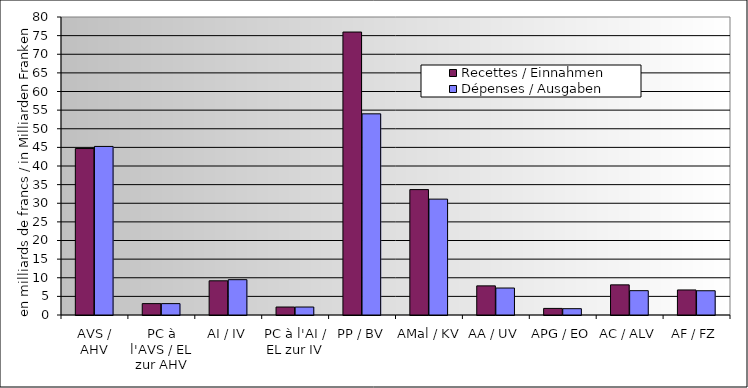
| Category | Recettes / Einnahmen | Dépenses / Ausgaben |
|---|---|---|
| AVS / AHV | 44.689 | 45.254 |
| PC à l'AVS / EL zur AHV | 3.058 | 3.058 |
| AI / IV | 9.182 | 9.484 |
| PC à l'AI / EL zur IV | 2.142 | 2.142 |
| PP / BV | 75.965 | 54.003 |
| AMal / KV | 33.664 | 31.105 |
| AA / UV | 7.821 | 7.24 |
| APG / EO | 1.766 | 1.695 |
| AC / ALV | 8.095 | 6.531 |
| AF / FZ | 6.722 | 6.513 |